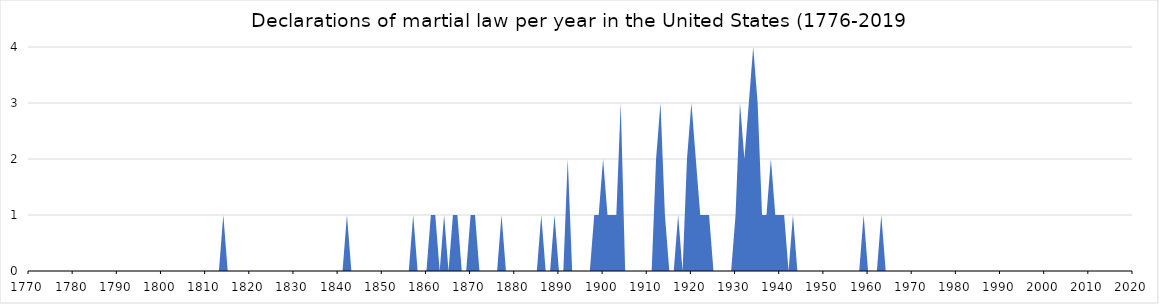
| Category | Declarations |
|---|---|
| 1770.0 | 0 |
| 1771.0 | 0 |
| 1772.0 | 0 |
| 1773.0 | 0 |
| 1774.0 | 0 |
| 1775.0 | 0 |
| 1776.0 | 0 |
| 1777.0 | 0 |
| 1778.0 | 0 |
| 1779.0 | 0 |
| 1780.0 | 0 |
| 1781.0 | 0 |
| 1782.0 | 0 |
| 1783.0 | 0 |
| 1784.0 | 0 |
| 1785.0 | 0 |
| 1786.0 | 0 |
| 1787.0 | 0 |
| 1788.0 | 0 |
| 1789.0 | 0 |
| 1790.0 | 0 |
| 1791.0 | 0 |
| 1792.0 | 0 |
| 1793.0 | 0 |
| 1794.0 | 0 |
| 1795.0 | 0 |
| 1796.0 | 0 |
| 1797.0 | 0 |
| 1798.0 | 0 |
| 1799.0 | 0 |
| 1800.0 | 0 |
| 1801.0 | 0 |
| 1802.0 | 0 |
| 1803.0 | 0 |
| 1804.0 | 0 |
| 1805.0 | 0 |
| 1806.0 | 0 |
| 1807.0 | 0 |
| 1808.0 | 0 |
| 1809.0 | 0 |
| 1810.0 | 0 |
| 1811.0 | 0 |
| 1812.0 | 0 |
| 1813.0 | 0 |
| 1814.0 | 1 |
| 1815.0 | 0 |
| 1816.0 | 0 |
| 1817.0 | 0 |
| 1818.0 | 0 |
| 1819.0 | 0 |
| 1820.0 | 0 |
| 1821.0 | 0 |
| 1822.0 | 0 |
| 1823.0 | 0 |
| 1824.0 | 0 |
| 1825.0 | 0 |
| 1826.0 | 0 |
| 1827.0 | 0 |
| 1828.0 | 0 |
| 1829.0 | 0 |
| 1830.0 | 0 |
| 1831.0 | 0 |
| 1832.0 | 0 |
| 1833.0 | 0 |
| 1834.0 | 0 |
| 1835.0 | 0 |
| 1836.0 | 0 |
| 1837.0 | 0 |
| 1838.0 | 0 |
| 1839.0 | 0 |
| 1840.0 | 0 |
| 1841.0 | 0 |
| 1842.0 | 1 |
| 1843.0 | 0 |
| 1844.0 | 0 |
| 1845.0 | 0 |
| 1846.0 | 0 |
| 1847.0 | 0 |
| 1848.0 | 0 |
| 1849.0 | 0 |
| 1850.0 | 0 |
| 1851.0 | 0 |
| 1852.0 | 0 |
| 1853.0 | 0 |
| 1854.0 | 0 |
| 1855.0 | 0 |
| 1856.0 | 0 |
| 1857.0 | 1 |
| 1858.0 | 0 |
| 1859.0 | 0 |
| 1860.0 | 0 |
| 1861.0 | 1 |
| 1862.0 | 1 |
| 1863.0 | 0 |
| 1864.0 | 1 |
| 1865.0 | 0 |
| 1866.0 | 1 |
| 1867.0 | 1 |
| 1868.0 | 0 |
| 1869.0 | 0 |
| 1870.0 | 1 |
| 1871.0 | 1 |
| 1872.0 | 0 |
| 1873.0 | 0 |
| 1874.0 | 0 |
| 1875.0 | 0 |
| 1876.0 | 0 |
| 1877.0 | 1 |
| 1878.0 | 0 |
| 1879.0 | 0 |
| 1880.0 | 0 |
| 1881.0 | 0 |
| 1882.0 | 0 |
| 1883.0 | 0 |
| 1884.0 | 0 |
| 1885.0 | 0 |
| 1886.0 | 1 |
| 1887.0 | 0 |
| 1888.0 | 0 |
| 1889.0 | 1 |
| 1890.0 | 0 |
| 1891.0 | 0 |
| 1892.0 | 2 |
| 1893.0 | 0 |
| 1894.0 | 0 |
| 1895.0 | 0 |
| 1896.0 | 0 |
| 1897.0 | 0 |
| 1898.0 | 1 |
| 1899.0 | 1 |
| 1900.0 | 2 |
| 1901.0 | 1 |
| 1902.0 | 1 |
| 1903.0 | 1 |
| 1904.0 | 3 |
| 1905.0 | 0 |
| 1906.0 | 0 |
| 1907.0 | 0 |
| 1908.0 | 0 |
| 1909.0 | 0 |
| 1910.0 | 0 |
| 1911.0 | 0 |
| 1912.0 | 2 |
| 1913.0 | 3 |
| 1914.0 | 1 |
| 1915.0 | 0 |
| 1916.0 | 0 |
| 1917.0 | 1 |
| 1918.0 | 0 |
| 1919.0 | 2 |
| 1920.0 | 3 |
| 1921.0 | 2 |
| 1922.0 | 1 |
| 1923.0 | 1 |
| 1924.0 | 1 |
| 1925.0 | 0 |
| 1926.0 | 0 |
| 1927.0 | 0 |
| 1928.0 | 0 |
| 1929.0 | 0 |
| 1930.0 | 1 |
| 1931.0 | 3 |
| 1932.0 | 2 |
| 1933.0 | 3 |
| 1934.0 | 4 |
| 1935.0 | 3 |
| 1936.0 | 1 |
| 1937.0 | 1 |
| 1938.0 | 2 |
| 1939.0 | 1 |
| 1940.0 | 1 |
| 1941.0 | 1 |
| 1942.0 | 0 |
| 1943.0 | 1 |
| 1944.0 | 0 |
| 1945.0 | 0 |
| 1946.0 | 0 |
| 1947.0 | 0 |
| 1948.0 | 0 |
| 1949.0 | 0 |
| 1950.0 | 0 |
| 1951.0 | 0 |
| 1952.0 | 0 |
| 1953.0 | 0 |
| 1954.0 | 0 |
| 1955.0 | 0 |
| 1956.0 | 0 |
| 1957.0 | 0 |
| 1958.0 | 0 |
| 1959.0 | 1 |
| 1960.0 | 0 |
| 1961.0 | 0 |
| 1962.0 | 0 |
| 1963.0 | 1 |
| 1964.0 | 0 |
| 1965.0 | 0 |
| 1966.0 | 0 |
| 1967.0 | 0 |
| 1968.0 | 0 |
| 1969.0 | 0 |
| 1970.0 | 0 |
| 1971.0 | 0 |
| 1972.0 | 0 |
| 1973.0 | 0 |
| 1974.0 | 0 |
| 1975.0 | 0 |
| 1976.0 | 0 |
| 1977.0 | 0 |
| 1978.0 | 0 |
| 1979.0 | 0 |
| 1980.0 | 0 |
| 1981.0 | 0 |
| 1982.0 | 0 |
| 1983.0 | 0 |
| 1984.0 | 0 |
| 1985.0 | 0 |
| 1986.0 | 0 |
| 1987.0 | 0 |
| 1988.0 | 0 |
| 1989.0 | 0 |
| 1990.0 | 0 |
| 1991.0 | 0 |
| 1992.0 | 0 |
| 1993.0 | 0 |
| 1994.0 | 0 |
| 1995.0 | 0 |
| 1996.0 | 0 |
| 1997.0 | 0 |
| 1998.0 | 0 |
| 1999.0 | 0 |
| 2000.0 | 0 |
| 2001.0 | 0 |
| 2002.0 | 0 |
| 2003.0 | 0 |
| 2004.0 | 0 |
| 2005.0 | 0 |
| 2006.0 | 0 |
| 2007.0 | 0 |
| 2008.0 | 0 |
| 2009.0 | 0 |
| 2010.0 | 0 |
| 2011.0 | 0 |
| 2012.0 | 0 |
| 2013.0 | 0 |
| 2014.0 | 0 |
| 2015.0 | 0 |
| 2016.0 | 0 |
| 2017.0 | 0 |
| 2018.0 | 0 |
| 2019.0 | 0 |
| 2020.0 | 0 |